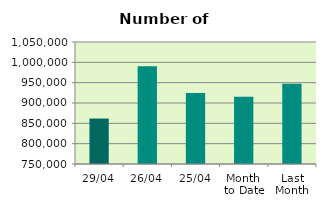
| Category | Series 0 |
|---|---|
| 29/04 | 861742 |
| 26/04 | 990184 |
| 25/04 | 924750 |
| Month 
to Date | 915148.105 |
| Last
Month | 947588.19 |